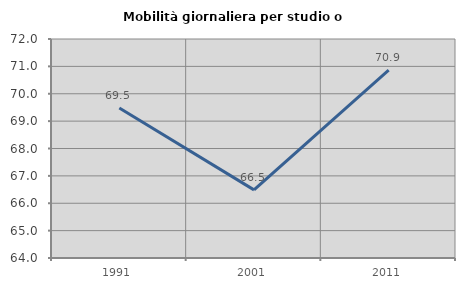
| Category | Mobilità giornaliera per studio o lavoro |
|---|---|
| 1991.0 | 69.476 |
| 2001.0 | 66.489 |
| 2011.0 | 70.859 |